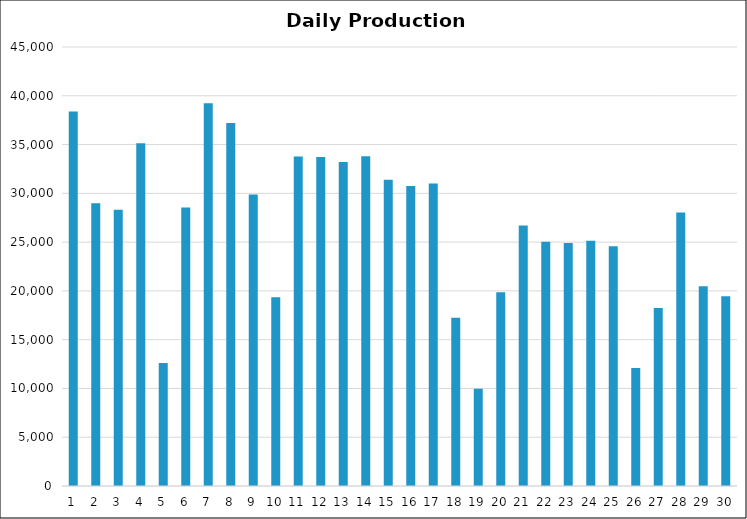
| Category | Series 0 |
|---|---|
| 0 | 38379 |
| 1 | 28991.25 |
| 2 | 28321.25 |
| 3 | 35125.5 |
| 4 | 12601.75 |
| 5 | 28556.25 |
| 6 | 39246.25 |
| 7 | 37222.25 |
| 8 | 29891 |
| 9 | 19344 |
| 10 | 33781.75 |
| 11 | 33713.75 |
| 12 | 33203.5 |
| 13 | 33789.5 |
| 14 | 31383.5 |
| 15 | 30748 |
| 16 | 31003 |
| 17 | 17250 |
| 18 | 9980.75 |
| 19 | 19865.25 |
| 20 | 26706.25 |
| 21 | 25027.75 |
| 22 | 24917.5 |
| 23 | 25139.75 |
| 24 | 24580.75 |
| 25 | 12089.25 |
| 26 | 18245 |
| 27 | 28023.25 |
| 28 | 20473.5 |
| 29 | 19445 |